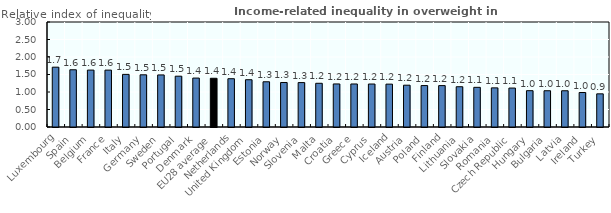
| Category | Coefficient |
|---|---|
| Luxembourg | 1.709 |
| Spain | 1.635 |
| Belgium | 1.626 |
| France | 1.625 |
| Italy | 1.503 |
| Germany | 1.491 |
| Sweden | 1.488 |
| Portugal | 1.452 |
| Denmark | 1.398 |
| EU28 average | 1.392 |
| Netherlands | 1.38 |
| United Kingdom | 1.351 |
| Estonia | 1.292 |
| Norway | 1.271 |
| Slovenia | 1.269 |
| Malta | 1.249 |
| Croatia | 1.23 |
| Greece | 1.229 |
| Cyprus | 1.228 |
| Iceland | 1.225 |
| Austria | 1.195 |
| Poland | 1.184 |
| Finland | 1.183 |
| Lithuania | 1.151 |
| Slovakia | 1.133 |
| Romania | 1.118 |
| Czech Republic | 1.113 |
| Hungary | 1.038 |
| Bulgaria | 1.036 |
| Latvia | 1.035 |
| Ireland | 0.985 |
| Turkey | 0.947 |